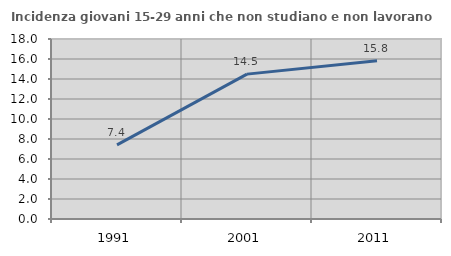
| Category | Incidenza giovani 15-29 anni che non studiano e non lavorano  |
|---|---|
| 1991.0 | 7.407 |
| 2001.0 | 14.488 |
| 2011.0 | 15.82 |